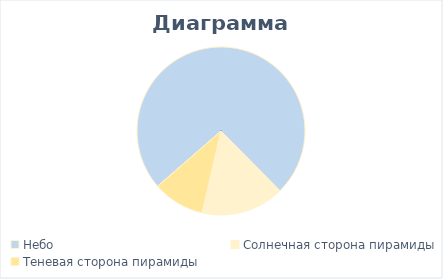
| Category | Series 0 |
|---|---|
| Небо | 0.74 |
| Солнечная сторона пирамиды | 0.16 |
| Теневая сторона пирамиды | 0.1 |